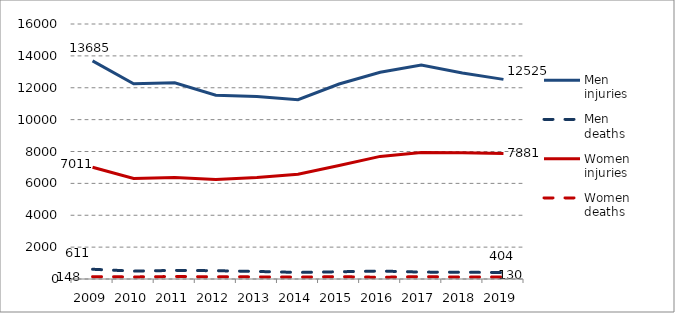
| Category | Men | Women |
|---|---|---|
| 2009 | 611 | 148 |
| 2010 | 494 | 129 |
| 2011 | 540 | 157 |
| 2012 | 520 | 136 |
| 2013 | 474 | 134 |
| 2014 | 413 | 118 |
| 2015 | 454 | 145 |
| 2016 | 499 | 108 |
| 2017 | 433 | 146 |
| 2018 | 425 | 123 |
| 2019 | 404 | 130 |